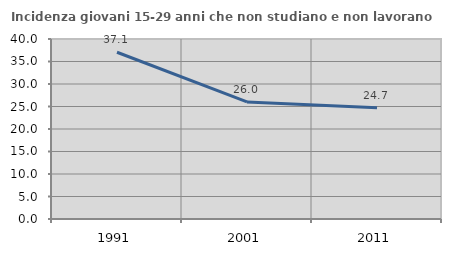
| Category | Incidenza giovani 15-29 anni che non studiano e non lavorano  |
|---|---|
| 1991.0 | 37.054 |
| 2001.0 | 26.016 |
| 2011.0 | 24.731 |